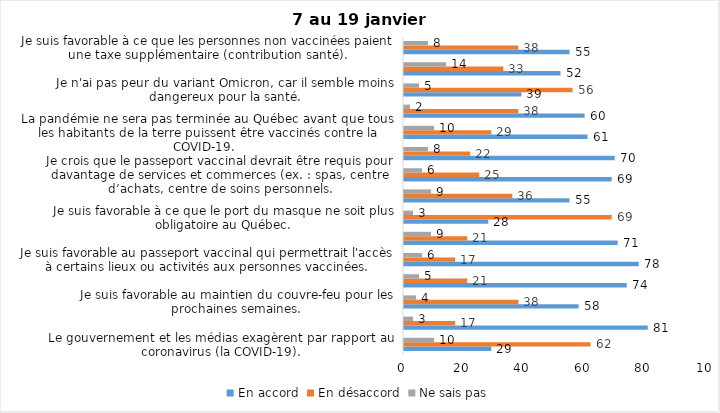
| Category | En accord | En désaccord | Ne sais pas |
|---|---|---|---|
| Le gouvernement et les médias exagèrent par rapport au coronavirus (la COVID-19). | 29 | 62 | 10 |
| J’ai peur que le système de santé soit débordé par les cas de COVID-19. | 81 | 17 | 3 |
| Je suis favorable au maintien du couvre-feu pour les prochaines semaines. | 58 | 38 | 4 |
| Je suis inquiet/inquiète que le nombre de cas augmente en raison des nouveaux variants du virus de la COVID-19. | 74 | 21 | 5 |
| Je suis favorable au passeport vaccinal qui permettrait l'accès à certains lieux ou activités aux personnes vaccinées. | 78 | 17 | 6 |
| Je suis confiant que la vaccination protège efficacement contre les variants de la COVID-19 | 71 | 21 | 9 |
| Je suis favorable à ce que le port du masque ne soit plus obligatoire au Québec. | 28 | 69 | 3 |
| J'ai peur que la reprise des cours en présentiel dans les écoles primaires et secondaires génère une augmentation des cas de COVID-19 | 55 | 36 | 9 |
| Je crois que le passeport vaccinal devrait être requis pour davantage de services et commerces (ex. : spas, centre d’achats, centre de soins personnels. | 69 | 25 | 6 |
| Les personnes non adéquatement vaccinées contre la COVID-19 sont responsables des nouveaux cas et hospitalisations et contribuent à la prolongation de la pandémie au Québec. | 70 | 22 | 8 |
| La pandémie ne sera pas terminée au Québec avant que tous les habitants de la terre puissent être vaccinés contre la COVID-19.   | 61 | 29 | 10 |
| Je suis inconfortable d’être en contact avec une personne non vaccinée contre la COVID-19 | 60 | 38 | 2 |
| Je n'ai pas peur du variant Omicron, car il semble moins dangereux pour la santé. | 39 | 56 | 5 |
| La vaccination obligatoire contre la COVID-19 mettrait fin à la pandémie. | 52 | 33 | 14 |
| Je suis favorable à ce que les personnes non vaccinées paient une taxe supplémentaire (contribution santé). | 55 | 38 | 8 |